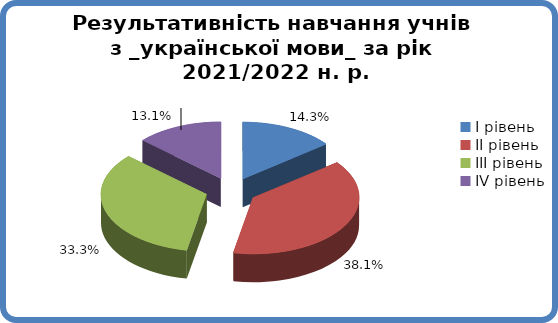
| Category | Series 0 |
|---|---|
| 0 | 0.143 |
| 1 | 0.381 |
| 2 | 0.333 |
| 3 | 0.131 |